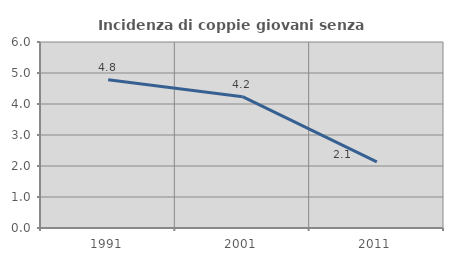
| Category | Incidenza di coppie giovani senza figli |
|---|---|
| 1991.0 | 4.781 |
| 2001.0 | 4.237 |
| 2011.0 | 2.132 |